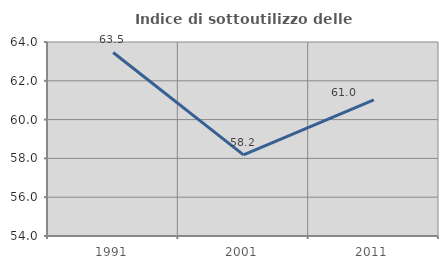
| Category | Indice di sottoutilizzo delle abitazioni  |
|---|---|
| 1991.0 | 63.462 |
| 2001.0 | 58.182 |
| 2011.0 | 61.017 |